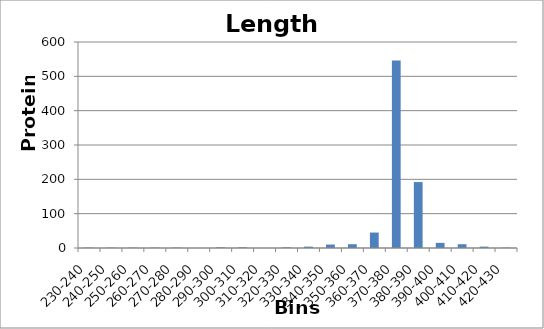
| Category | Series 0 |
|---|---|
| 230-240 | 1 |
| 240-250 | 1 |
| 250-260 | 1 |
| 260-270 | 1 |
| 270-280 | 1 |
| 280-290 | 0 |
| 290-300 | 2 |
| 300-310 | 2 |
| 310-320 | 0 |
| 320-330 | 2 |
| 330-340 | 4 |
| 340-350 | 10 |
| 350-360 | 11 |
| 360-370 | 45 |
| 370-380 | 546 |
| 380-390 | 192 |
| 390-400 | 15 |
| 400-410 | 11 |
| 410-420 | 4 |
| 420-430 | 1 |